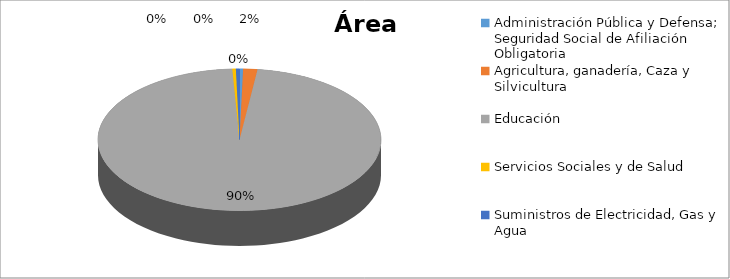
| Category | Series 0 |
|---|---|
| Administración Pública y Defensa; Seguridad Social de Afiliación Obligatoria | 0.004 |
| Agricultura, ganadería, Caza y Silvicultura | 0.015 |
| Educación | 0.902 |
| Servicios Sociales y de Salud | 0.004 |
| Suministros de Electricidad, Gas y Agua | 0.004 |